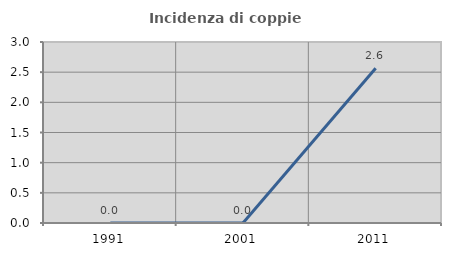
| Category | Incidenza di coppie miste |
|---|---|
| 1991.0 | 0 |
| 2001.0 | 0 |
| 2011.0 | 2.564 |